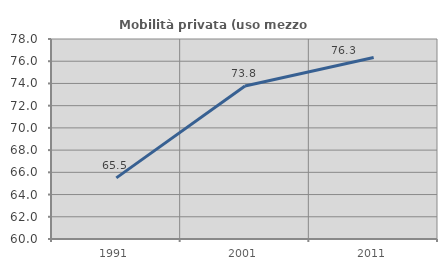
| Category | Mobilità privata (uso mezzo privato) |
|---|---|
| 1991.0 | 65.5 |
| 2001.0 | 73.771 |
| 2011.0 | 76.34 |